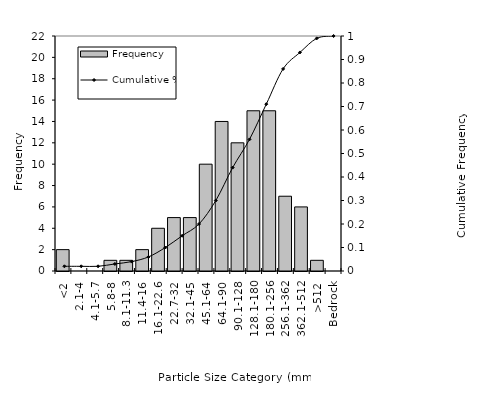
| Category | Frequency |
|---|---|
| <2 | 2 |
| 2.1-4 | 0 |
| 4.1-5.7 | 0 |
| 5.8-8 | 1 |
| 8.1-11.3 | 1 |
| 11.4-16 | 2 |
| 16.1-22.6 | 4 |
| 22.7-32 | 5 |
| 32.1-45 | 5 |
| 45.1-64 | 10 |
| 64.1-90 | 14 |
| 90.1-128 | 12 |
| 128.1-180 | 15 |
| 180.1-256 | 15 |
| 256.1-362 | 7 |
| 362.1-512 | 6 |
| >512 | 1 |
| Bedrock | 0 |